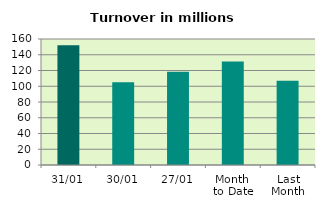
| Category | Series 0 |
|---|---|
| 31/01 | 151.993 |
| 30/01 | 105.058 |
| 27/01 | 118.306 |
| Month 
to Date | 131.402 |
| Last
Month | 107.094 |